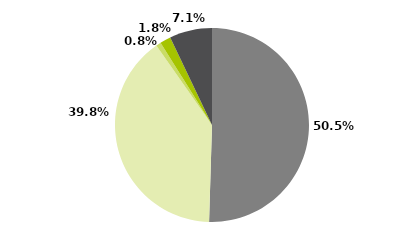
| Category | Series 0 |
|---|---|
| Multimercados Macro | 0.505 |
| Multimercados Livre | 0.398 |
| Multimercados L/S - Neutro | 0.008 |
| Multimercados L/S - Direcional | 0.018 |
| Outros | 0.071 |